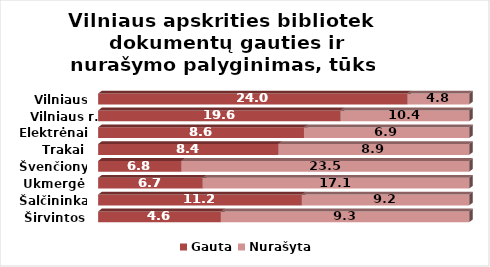
| Category | Gauta | Nurašyta |
|---|---|---|
| Širvintos | 4.6 | 9.3 |
| Šalčininkai | 11.2 | 9.2 |
| Ukmergė | 6.7 | 17.1 |
| Švenčionys | 6.8 | 23.5 |
| Trakai | 8.4 | 8.9 |
| Elektrėnai | 8.6 | 6.9 |
| Vilniaus r. | 19.6 | 10.4 |
| Vilniaus m. | 24 | 4.8 |